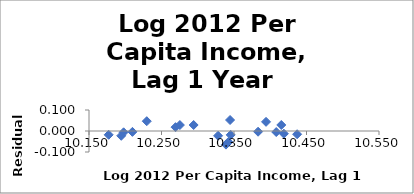
| Category | Series 0 |
|---|---|
| 10.177140112911868 | -0.018 |
| 10.194444217168096 | -0.023 |
| 10.197738357876835 | -0.006 |
| 10.209871095113895 | -0.004 |
| 10.229680344962286 | 0.047 |
| 10.269401841478274 | 0.018 |
| 10.27535126675651 | 0.028 |
| 10.294312683904778 | 0.029 |
| 10.328046200143529 | -0.023 |
| 10.34225145395748 | -0.052 |
| 10.338912536237203 | -0.065 |
| 10.345429457142641 | -0.019 |
| 10.344548578539603 | 0.052 |
| 10.383211150570176 | -0.003 |
| 10.394215487245056 | 0.044 |
| 10.415232252196809 | 0.029 |
| 10.408272526506297 | -0.005 |
| 10.418795221453689 | -0.013 |
| 10.437083800770608 | -0.015 |